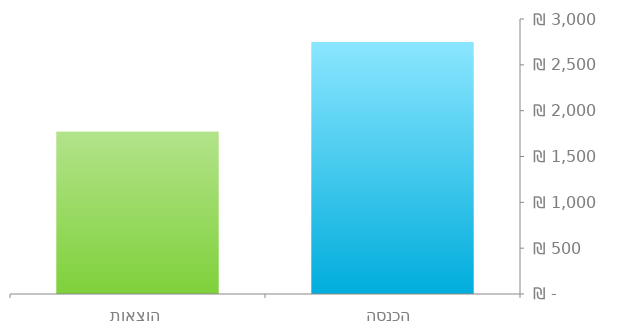
| Category | Data |
|---|---|
| הכנסה | 2750 |
| הוצאות | 1770 |